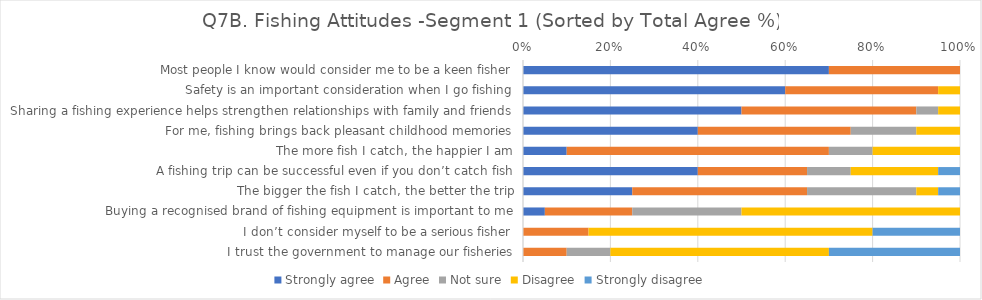
| Category | Strongly agree | Agree | Not sure | Disagree | Strongly disagree |
|---|---|---|---|---|---|
| Most people I know would consider me to be a keen fisher | 0.7 | 0.3 | 0 | 0 | 0 |
| Safety is an important consideration when I go fishing | 0.6 | 0.35 | 0 | 0.05 | 0 |
| Sharing a fishing experience helps strengthen relationships with family and friends | 0.5 | 0.4 | 0.05 | 0.05 | 0 |
| For me, fishing brings back pleasant childhood memories | 0.4 | 0.35 | 0.15 | 0.1 | 0 |
| The more fish I catch, the happier I am | 0.1 | 0.6 | 0.1 | 0.2 | 0 |
| A fishing trip can be successful even if you don’t catch fish | 0.4 | 0.25 | 0.1 | 0.2 | 0.05 |
| The bigger the fish I catch, the better the trip | 0.25 | 0.4 | 0.25 | 0.05 | 0.05 |
| Buying a recognised brand of fishing equipment is important to me | 0.05 | 0.2 | 0.25 | 0.5 | 0 |
| I don’t consider myself to be a serious fisher | 0 | 0.15 | 0 | 0.65 | 0.2 |
| I trust the government to manage our fisheries | 0 | 0.1 | 0.1 | 0.5 | 0.3 |